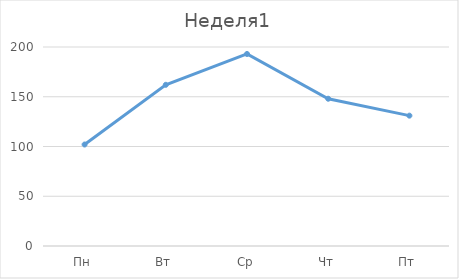
| Category | Неделя1 |
|---|---|
| Пн | 102 |
| Вт | 162 |
| Ср | 193 |
| Чт | 148 |
| Пт | 131 |